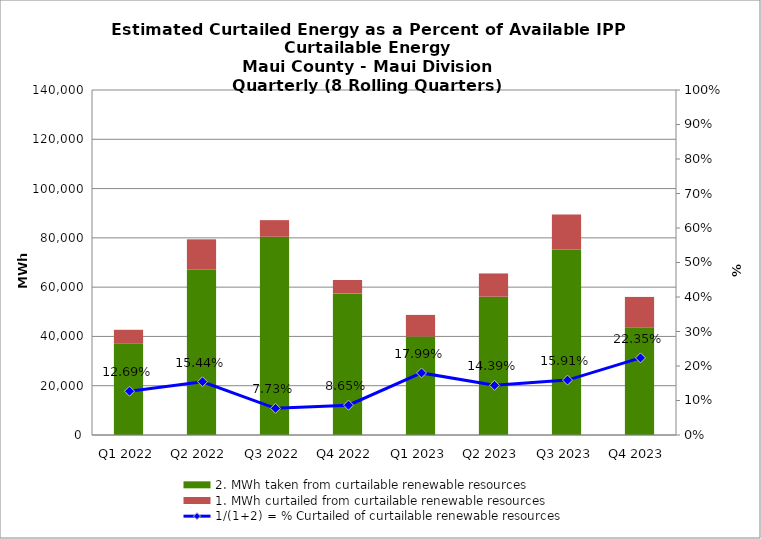
| Category | 2. MWh taken from curtailable renewable resources | 1. MWh curtailed from curtailable renewable resources |
|---|---|---|
| Q1 2022 | 37278.35 | 5418.479 |
| Q2 2022 | 67141.528 | 12262.436 |
| Q3 2022 | 80449.999 | 6736.668 |
| Q4 2022 | 57464.618 | 5439.912 |
| Q1 2023 | 39966.303 | 8768.507 |
| Q2 2023 | 56123.445 | 9436.915 |
| Q3 2023 | 75238.832 | 14240.357 |
| Q4 2023 | 43507.15 | 12521.6 |